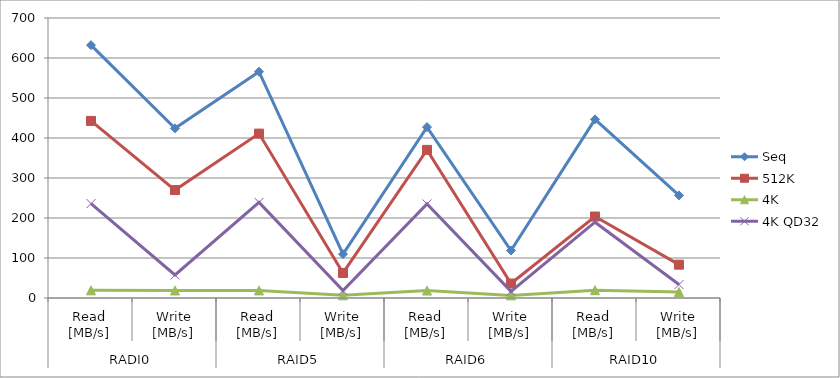
| Category | Seq | 512K | 4K | 4K QD32 |
|---|---|---|---|---|
| 0 | 632.1 | 442.7 | 19.17 | 236.1 |
| 1 | 424.1 | 269.9 | 18.81 | 57.58 |
| 2 | 565.7 | 411 | 19.01 | 239.1 |
| 3 | 109.7 | 62.58 | 6.612 | 18.37 |
| 4 | 427.3 | 370.3 | 18.64 | 235.1 |
| 5 | 118.7 | 36.15 | 6.568 | 16.63 |
| 6 | 446.6 | 203.7 | 19.59 | 189.5 |
| 7 | 256.5 | 83.33 | 15.13 | 33.71 |